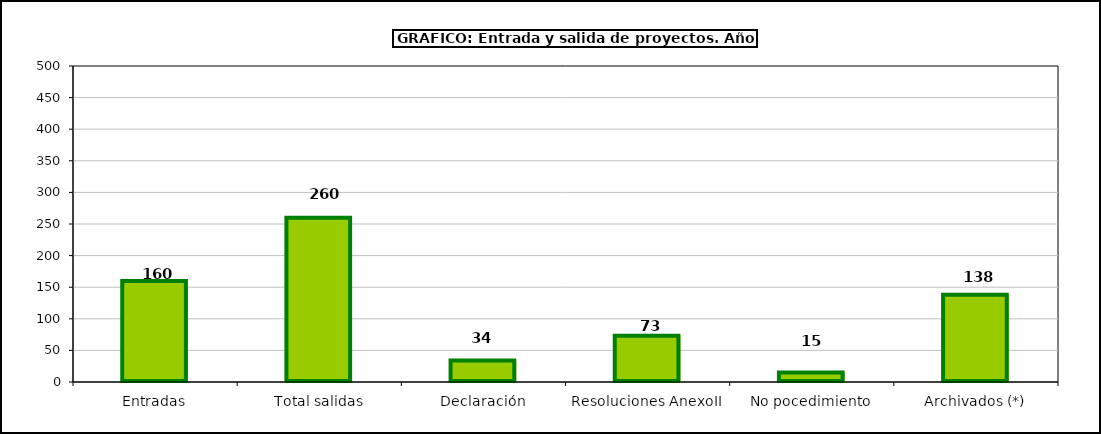
| Category | Total |
|---|---|
| 0 | 160 |
| 1 | 260 |
| 2 | 34 |
| 3 | 73 |
| 4 | 15 |
| 5 | 138 |